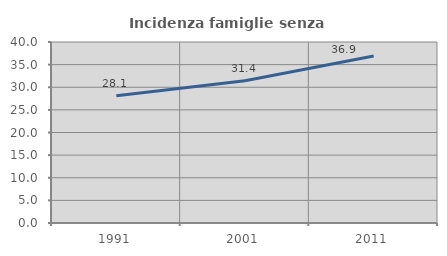
| Category | Incidenza famiglie senza nuclei |
|---|---|
| 1991.0 | 28.137 |
| 2001.0 | 31.445 |
| 2011.0 | 36.906 |